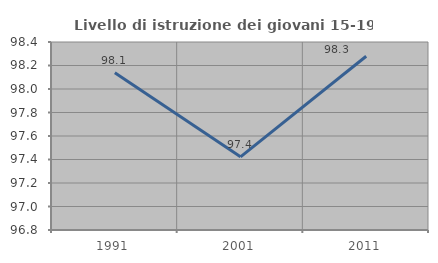
| Category | Livello di istruzione dei giovani 15-19 anni |
|---|---|
| 1991.0 | 98.138 |
| 2001.0 | 97.423 |
| 2011.0 | 98.279 |